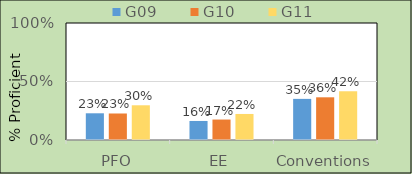
| Category | G09 | G10 | G11 |
|---|---|---|---|
| PFO | 22.83 | 22.655 | 29.671 |
| EE | 16.273 | 17.48 | 22.257 |
| Conventions | 35.145 | 36.491 | 41.662 |